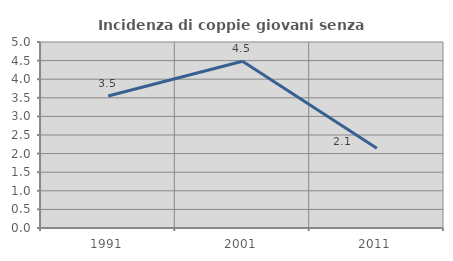
| Category | Incidenza di coppie giovani senza figli |
|---|---|
| 1991.0 | 3.549 |
| 2001.0 | 4.482 |
| 2011.0 | 2.143 |